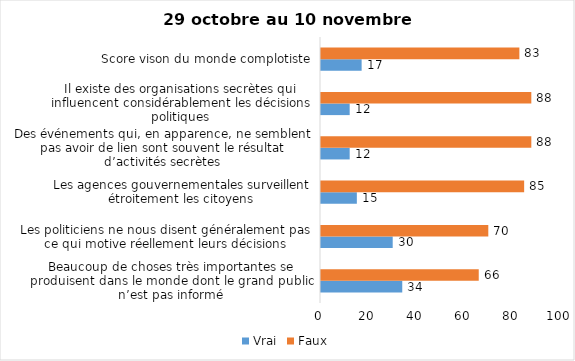
| Category | Vrai | Faux |
|---|---|---|
| Beaucoup de choses très importantes se produisent dans le monde dont le grand public n’est pas informé | 34 | 66 |
| Les politiciens ne nous disent généralement pas ce qui motive réellement leurs décisions | 30 | 70 |
| Les agences gouvernementales surveillent étroitement les citoyens | 15 | 85 |
| Des événements qui, en apparence, ne semblent pas avoir de lien sont souvent le résultat d’activités secrètes | 12 | 88 |
| Il existe des organisations secrètes qui influencent considérablement les décisions politiques | 12 | 88 |
| Score vison du monde complotiste | 17 | 83 |